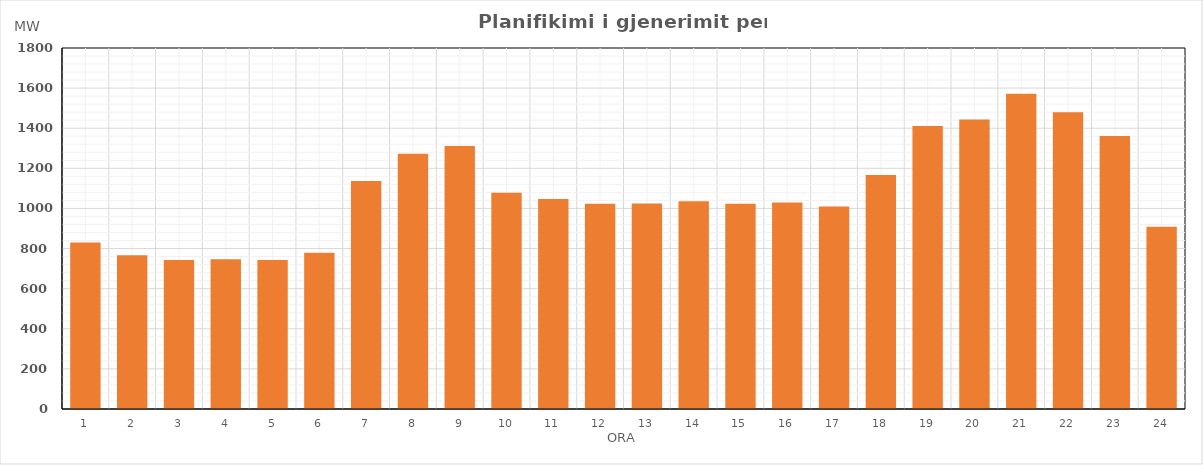
| Category | Max (MW) |
|---|---|
| 0 | 829.79 |
| 1 | 766.09 |
| 2 | 743.07 |
| 3 | 746.24 |
| 4 | 742.45 |
| 5 | 778.79 |
| 6 | 1136.59 |
| 7 | 1272.29 |
| 8 | 1311.88 |
| 9 | 1078.01 |
| 10 | 1047.3 |
| 11 | 1022.99 |
| 12 | 1024.88 |
| 13 | 1036.38 |
| 14 | 1023.58 |
| 15 | 1029.69 |
| 16 | 1009.28 |
| 17 | 1166.4 |
| 18 | 1410.71 |
| 19 | 1443.02 |
| 20 | 1571.97 |
| 21 | 1479.5 |
| 22 | 1360.99 |
| 23 | 908.21 |